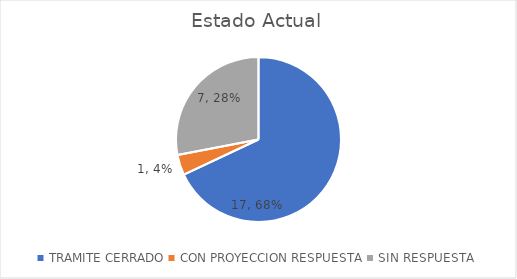
| Category | Series 0 |
|---|---|
| TRAMITE CERRADO | 17 |
| CON PROYECCION RESPUESTA | 1 |
| SIN RESPUESTA | 7 |